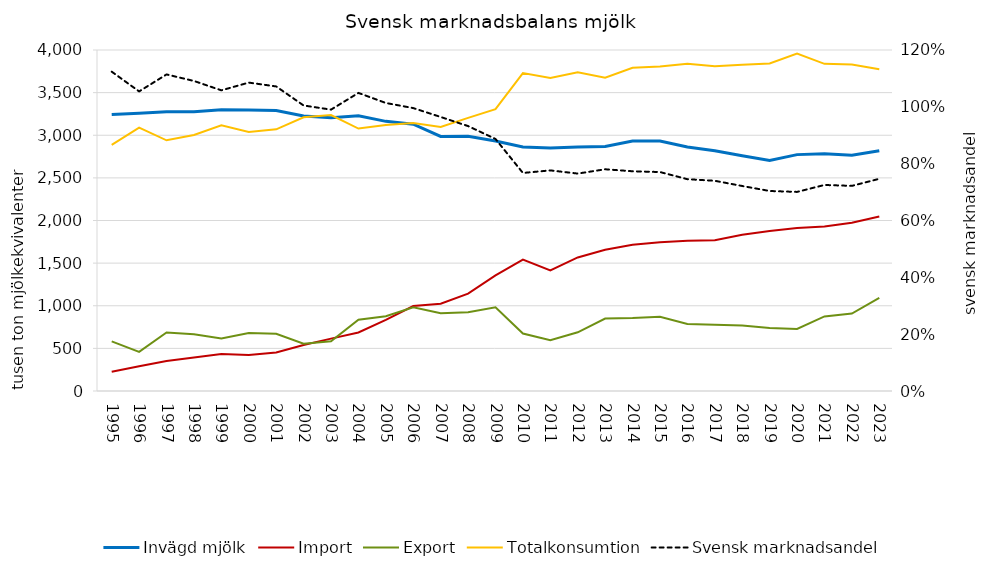
| Category | Invägd mjölk | Import | Export | Totalkonsumtion |
|---|---|---|---|---|
| 1995.0 | 3243 | 224.833 | 581.816 | 2886.017 |
| 1996.0 | 3258 | 291.376 | 459.131 | 3090.245 |
| 1997.0 | 3276 | 351.76 | 686.898 | 2940.862 |
| 1998.0 | 3277 | 393.541 | 666.875 | 3003.666 |
| 1999.0 | 3299 | 434.709 | 615.826 | 3117.883 |
| 2000.0 | 3297 | 421.794 | 680.905 | 3037.889 |
| 2001.0 | 3290 | 451.039 | 671.289 | 3069.75 |
| 2002.0 | 3226 | 539.863 | 555.032 | 3210.831 |
| 2003.0 | 3206 | 614.648 | 582.922 | 3237.726 |
| 2004.0 | 3229 | 686.232 | 836.978 | 3078.254 |
| 2005.0 | 3163 | 834.817 | 877.146 | 3120.671 |
| 2006.0 | 3130 | 996.274 | 982.44 | 3143.834 |
| 2007.0 | 2986 | 1023.111 | 912.731 | 3096.38 |
| 2008.0 | 2987 | 1141.328 | 924.348 | 3203.98 |
| 2009.0 | 2933 | 1355.99 | 982.214 | 3306.776 |
| 2010.0 | 2862 | 1541.789 | 673.973 | 3729.816 |
| 2011.0 | 2850 | 1415.505 | 594.453 | 3671.052 |
| 2012.0 | 2861 | 1566.93 | 688.697 | 3739.233 |
| 2013.0 | 2868 | 1657.354 | 849.573 | 3675.781 |
| 2014.0 | 2931.25 | 1716.012 | 856.474 | 3790.788 |
| 2015.0 | 2933.16 | 1744.013 | 870.522 | 3806.651 |
| 2016.0 | 2862 | 1763.231 | 785.53 | 3839.701 |
| 2017.0 | 2817 | 1767.592 | 776.615 | 3807.977 |
| 2018.0 | 2760 | 1832.973 | 767.095 | 3825.878 |
| 2019.0 | 2704 | 1878.01 | 740.083 | 3841.927 |
| 2020.0 | 2772.74 | 1913.102 | 728.43 | 3957.412 |
| 2021.0 | 2782.22 | 1930.355 | 875.076 | 3837.499 |
| 2022.0 | 2764.84 | 1973.658 | 908.402 | 3830.096 |
| 2023.0 | 2818.53 | 2047.567 | 1091.11 | 3774.987 |